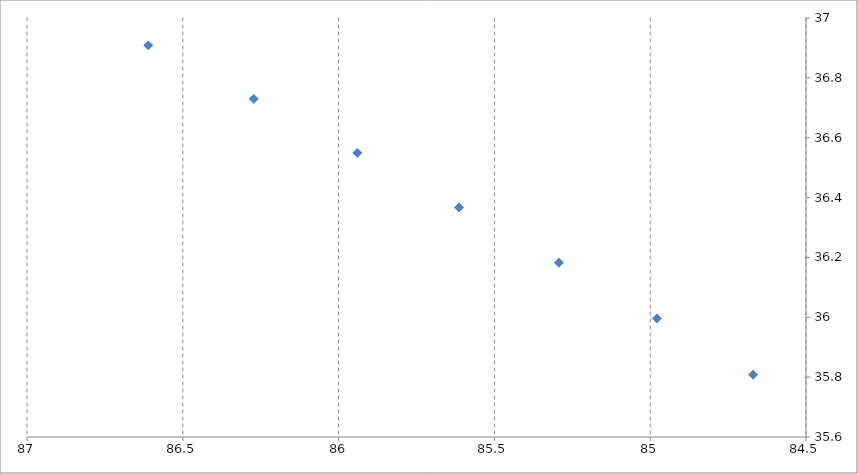
| Category | Series 0 |
|---|---|
| 86.61056499999995 | 36.908 |
| 86.27228444444427 | 36.73 |
| 85.9399294444438 | 36.549 |
| 85.61350000000039 | 36.367 |
| 85.29299611111128 | 36.182 |
| 84.97841777777785 | 35.996 |
| 84.66976499999964 | 35.808 |